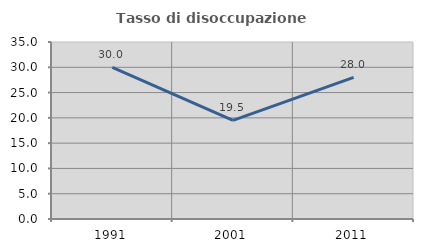
| Category | Tasso di disoccupazione giovanile  |
|---|---|
| 1991.0 | 30 |
| 2001.0 | 19.512 |
| 2011.0 | 28 |